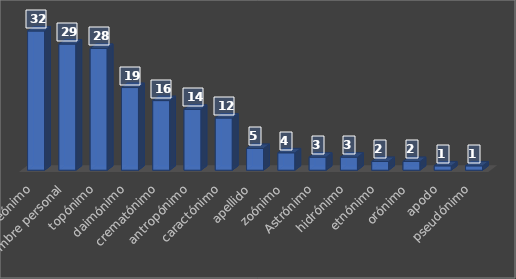
| Category | Series 0 |
|---|---|
| teónimo | 32 |
| nombre personal | 29 |
| topónimo | 28 |
| daimónimo | 19 |
| crematónimo | 16 |
| antropónimo | 14 |
| caractónimo | 12 |
| apellido | 5 |
| zoónimo | 4 |
| Astrónimo | 3 |
| hidrónimo | 3 |
| etnónimo | 2 |
| orónimo | 2 |
| apodo | 1 |
| pseudónimo | 1 |